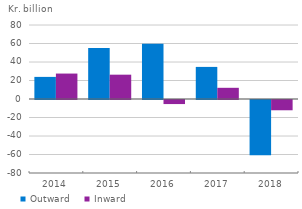
| Category | Outward  | Inward |
|---|---|---|
| 2014.0 | 23.9 | 27.5 |
| 2015.0 | 55.2 | 26.3 |
| 2016.0 | 59.6 | -4.4 |
| 2017.0 | 34.7 | 12.1 |
| 2018.0 | -59.7 | -11.1 |